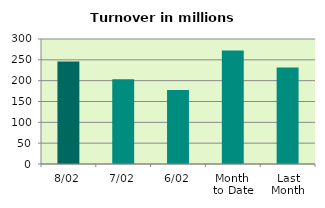
| Category | Series 0 |
|---|---|
| 8/02 | 245.998 |
| 7/02 | 203.568 |
| 6/02 | 177.431 |
| Month 
to Date | 272.409 |
| Last
Month | 231.348 |